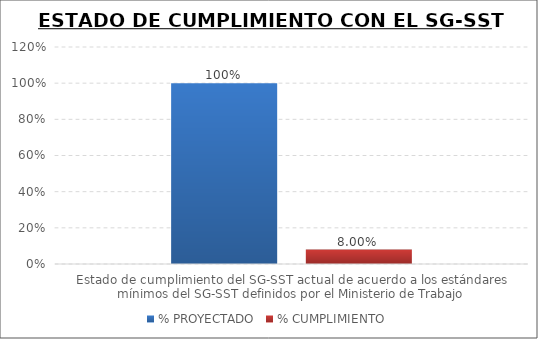
| Category | % PROYECTADO | % CUMPLIMIENTO |
|---|---|---|
| Estado de cumplimiento del SG-SST actual de acuerdo a los estándares mínimos del SG-SST definidos por el Ministerio de Trabajo | 1 | 0.08 |